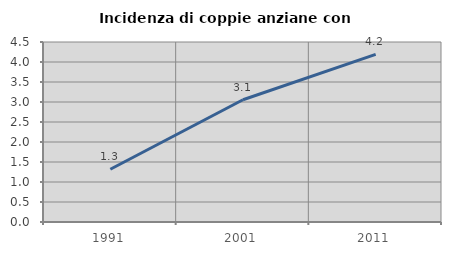
| Category | Incidenza di coppie anziane con figli |
|---|---|
| 1991.0 | 1.319 |
| 2001.0 | 3.057 |
| 2011.0 | 4.19 |